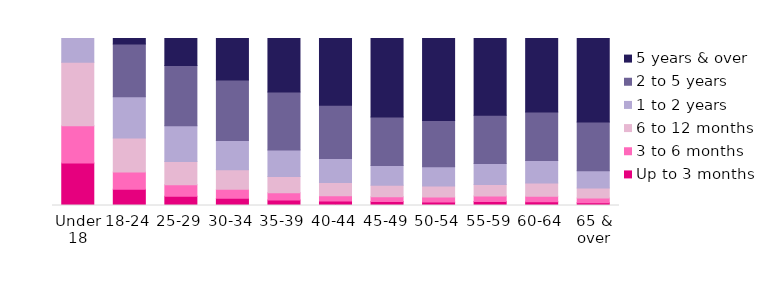
| Category | Up to 3 months | 3 to 6 months | 6 to 12 months | 1 to 2 years | 2 to 5 years | 5 years & over |
|---|---|---|---|---|---|---|
| Under 18 | 0.255 | 0.223 | 0.38 | 0.142 | 0 | 0 |
| 18-24 | 0.098 | 0.102 | 0.203 | 0.247 | 0.316 | 0.033 |
| 25-29 | 0.055 | 0.07 | 0.14 | 0.213 | 0.362 | 0.161 |
| 30-34 | 0.044 | 0.054 | 0.116 | 0.175 | 0.362 | 0.249 |
| 35-39 | 0.034 | 0.042 | 0.097 | 0.159 | 0.348 | 0.32 |
| 40-44 | 0.027 | 0.032 | 0.079 | 0.144 | 0.319 | 0.399 |
| 45-49 | 0.024 | 0.029 | 0.069 | 0.118 | 0.29 | 0.471 |
| 50-54 | 0.021 | 0.03 | 0.066 | 0.116 | 0.277 | 0.491 |
| 55-59 | 0.024 | 0.033 | 0.069 | 0.127 | 0.289 | 0.459 |
| 60-64 | 0.023 | 0.033 | 0.08 | 0.134 | 0.29 | 0.44 |
| 65 & over | 0.017 | 0.029 | 0.059 | 0.104 | 0.291 | 0.5 |